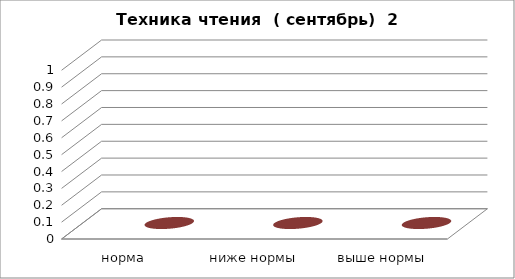
| Category | Series 0 | Series 1 |
|---|---|---|
| норма  |  | 0 |
| ниже нормы |  | 0 |
| выше нормы |  | 0 |